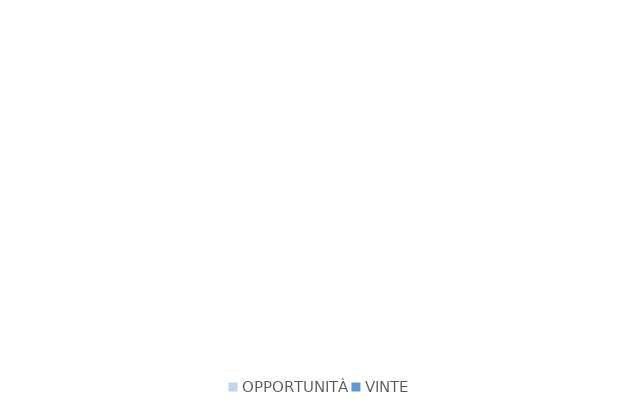
| Category | Series 0 |
|---|---|
| OPPORTUNITÀ | 0 |
| VINTE | 0 |